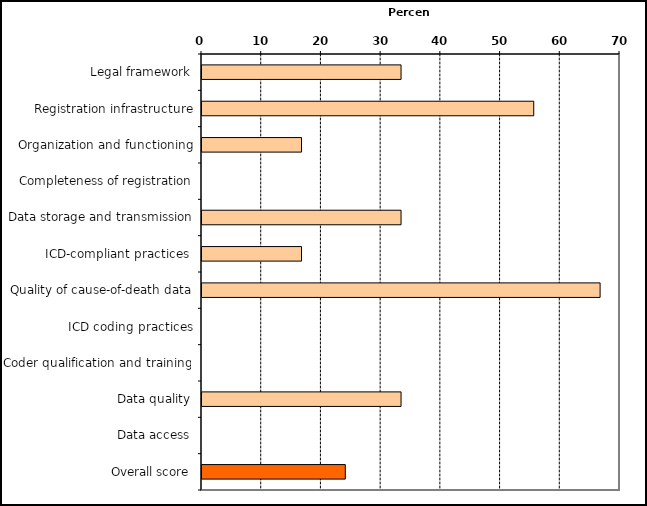
| Category | Series 0 |
|---|---|
| Legal framework | 33.333 |
| Registration infrastructure | 55.556 |
| Organization and functioning | 16.667 |
| Completeness of registration | 0 |
| Data storage and transmission | 33.333 |
| ICD-compliant practices  | 16.667 |
| Quality of cause-of-death data | 66.667 |
| ICD coding practices | 0 |
| Coder qualification and training | 0 |
| Data quality | 33.333 |
| Data access | 0 |
| Overall score | 24 |